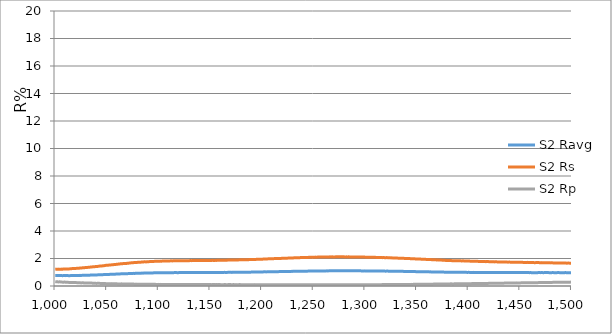
| Category | S2 Ravg | S2 Rs | S2 Rp |
|---|---|---|---|
| 1000.0 | 0.767 | 1.215 | 0.318 |
| 1000.49 | 0.764 | 1.228 | 0.3 |
| 1000.98 | 0.766 | 1.225 | 0.307 |
| 1001.47 | 0.764 | 1.221 | 0.306 |
| 1001.96 | 0.766 | 1.226 | 0.305 |
| 1002.45 | 0.763 | 1.222 | 0.305 |
| 1002.94 | 0.761 | 1.227 | 0.295 |
| 1003.43 | 0.763 | 1.224 | 0.303 |
| 1003.92 | 0.761 | 1.22 | 0.302 |
| 1004.4 | 0.759 | 1.225 | 0.293 |
| 1004.89 | 0.76 | 1.221 | 0.3 |
| 1005.61 | 0.765 | 1.232 | 0.298 |
| 1006.09 | 0.759 | 1.228 | 0.289 |
| 1006.58 | 0.761 | 1.233 | 0.288 |
| 1007.06 | 0.751 | 1.222 | 0.279 |
| 1007.54 | 0.757 | 1.227 | 0.287 |
| 1008.02 | 0.759 | 1.24 | 0.278 |
| 1008.5 | 0.764 | 1.244 | 0.285 |
| 1008.97 | 0.762 | 1.233 | 0.292 |
| 1009.45 | 0.76 | 1.245 | 0.275 |
| 1009.92 | 0.754 | 1.242 | 0.266 |
| 1010.4 | 0.756 | 1.247 | 0.266 |
| 1011.11 | 0.761 | 1.242 | 0.28 |
| 1011.58 | 0.763 | 1.254 | 0.272 |
| 1012.05 | 0.757 | 1.243 | 0.271 |
| 1012.52 | 0.759 | 1.248 | 0.27 |
| 1012.99 | 0.753 | 1.244 | 0.262 |
| 1013.46 | 0.759 | 1.25 | 0.268 |
| 1013.93 | 0.753 | 1.246 | 0.26 |
| 1014.4 | 0.759 | 1.258 | 0.259 |
| 1015.09 | 0.756 | 1.261 | 0.251 |
| 1015.56 | 0.758 | 1.258 | 0.257 |
| 1016.02 | 0.756 | 1.262 | 0.249 |
| 1016.48 | 0.762 | 1.267 | 0.256 |
| 1016.95 | 0.763 | 1.271 | 0.255 |
| 1017.41 | 0.765 | 1.275 | 0.254 |
| 1018.1 | 0.762 | 1.27 | 0.253 |
| 1018.55 | 0.764 | 1.275 | 0.253 |
| 1019.01 | 0.765 | 1.279 | 0.252 |
| 1019.47 | 0.756 | 1.268 | 0.244 |
| 1019.92 | 0.765 | 1.28 | 0.25 |
| 1020.6 | 0.77 | 1.29 | 0.249 |
| 1021.06 | 0.764 | 1.287 | 0.241 |
| 1021.51 | 0.77 | 1.291 | 0.248 |
| 1021.96 | 0.764 | 1.288 | 0.24 |
| 1022.41 | 0.766 | 1.293 | 0.239 |
| 1023.08 | 0.763 | 1.288 | 0.238 |
| 1023.53 | 0.768 | 1.299 | 0.238 |
| 1023.98 | 0.774 | 1.31 | 0.237 |
| 1024.42 | 0.768 | 1.307 | 0.229 |
| 1025.09 | 0.766 | 1.31 | 0.221 |
| 1025.53 | 0.771 | 1.315 | 0.228 |
| 1025.97 | 0.776 | 1.318 | 0.234 |
| 1026.42 | 0.774 | 1.322 | 0.226 |
| 1027.08 | 0.778 | 1.324 | 0.233 |
| 1027.52 | 0.776 | 1.328 | 0.225 |
| 1027.95 | 0.775 | 1.332 | 0.217 |
| 1028.61 | 0.782 | 1.341 | 0.223 |
| 1029.04 | 0.78 | 1.338 | 0.223 |
| 1029.48 | 0.778 | 1.334 | 0.222 |
| 1029.91 | 0.78 | 1.346 | 0.215 |
| 1030.56 | 0.777 | 1.348 | 0.207 |
| 1031.0 | 0.786 | 1.351 | 0.22 |
| 1031.43 | 0.781 | 1.355 | 0.206 |
| 1032.07 | 0.788 | 1.358 | 0.219 |
| 1032.5 | 0.783 | 1.355 | 0.211 |
| 1032.93 | 0.784 | 1.358 | 0.211 |
| 1033.57 | 0.792 | 1.374 | 0.21 |
| 1033.99 | 0.793 | 1.378 | 0.209 |
| 1034.42 | 0.788 | 1.375 | 0.202 |
| 1035.06 | 0.799 | 1.383 | 0.214 |
| 1035.48 | 0.797 | 1.387 | 0.207 |
| 1035.9 | 0.799 | 1.391 | 0.207 |
| 1036.53 | 0.792 | 1.386 | 0.199 |
| 1036.95 | 0.801 | 1.403 | 0.199 |
| 1037.58 | 0.805 | 1.405 | 0.204 |
| 1038.0 | 0.799 | 1.401 | 0.197 |
| 1038.42 | 0.801 | 1.405 | 0.197 |
| 1039.04 | 0.805 | 1.413 | 0.196 |
| 1039.46 | 0.803 | 1.41 | 0.196 |
| 1040.08 | 0.807 | 1.425 | 0.188 |
| 1040.49 | 0.805 | 1.421 | 0.188 |
| 1040.91 | 0.809 | 1.425 | 0.194 |
| 1041.53 | 0.81 | 1.433 | 0.187 |
| 1041.94 | 0.814 | 1.437 | 0.192 |
| 1042.55 | 0.815 | 1.438 | 0.192 |
| 1042.96 | 0.82 | 1.448 | 0.191 |
| 1043.58 | 0.817 | 1.443 | 0.19 |
| 1043.99 | 0.815 | 1.446 | 0.184 |
| 1044.6 | 0.812 | 1.448 | 0.177 |
| 1045.01 | 0.82 | 1.458 | 0.183 |
| 1045.41 | 0.821 | 1.467 | 0.176 |
| 1046.02 | 0.825 | 1.468 | 0.181 |
| 1046.43 | 0.829 | 1.472 | 0.187 |
| 1047.03 | 0.83 | 1.473 | 0.186 |
| 1047.44 | 0.825 | 1.477 | 0.173 |
| 1048.04 | 0.835 | 1.49 | 0.179 |
| 1048.44 | 0.836 | 1.493 | 0.179 |
| 1049.05 | 0.836 | 1.501 | 0.172 |
| 1049.45 | 0.831 | 1.491 | 0.171 |
| 1050.05 | 0.838 | 1.505 | 0.17 |
| 1050.45 | 0.842 | 1.509 | 0.176 |
| 1051.05 | 0.84 | 1.51 | 0.169 |
| 1051.45 | 0.841 | 1.513 | 0.169 |
| 1052.05 | 0.845 | 1.521 | 0.168 |
| 1052.45 | 0.842 | 1.517 | 0.168 |
| 1053.04 | 0.846 | 1.524 | 0.167 |
| 1053.44 | 0.844 | 1.521 | 0.167 |
| 1054.04 | 0.854 | 1.535 | 0.172 |
| 1054.44 | 0.852 | 1.538 | 0.166 |
| 1055.03 | 0.849 | 1.54 | 0.159 |
| 1055.43 | 0.857 | 1.549 | 0.165 |
| 1056.02 | 0.854 | 1.549 | 0.158 |
| 1056.42 | 0.861 | 1.558 | 0.164 |
| 1057.01 | 0.861 | 1.559 | 0.163 |
| 1057.41 | 0.86 | 1.563 | 0.157 |
| 1058.0 | 0.86 | 1.564 | 0.156 |
| 1058.6 | 0.866 | 1.57 | 0.162 |
| 1058.99 | 0.867 | 1.574 | 0.161 |
| 1059.58 | 0.867 | 1.586 | 0.149 |
| 1059.98 | 0.868 | 1.582 | 0.154 |
| 1060.57 | 0.871 | 1.588 | 0.154 |
| 1060.97 | 0.872 | 1.592 | 0.153 |
| 1061.56 | 0.876 | 1.599 | 0.153 |
| 1061.95 | 0.877 | 1.601 | 0.153 |
| 1062.55 | 0.88 | 1.609 | 0.152 |
| 1062.94 | 0.881 | 1.61 | 0.152 |
| 1063.54 | 0.881 | 1.611 | 0.151 |
| 1063.93 | 0.885 | 1.614 | 0.156 |
| 1064.52 | 0.883 | 1.621 | 0.145 |
| 1064.92 | 0.887 | 1.623 | 0.15 |
| 1065.51 | 0.884 | 1.624 | 0.144 |
| 1065.91 | 0.891 | 1.633 | 0.149 |
| 1066.5 | 0.889 | 1.634 | 0.143 |
| 1067.1 | 0.889 | 1.635 | 0.143 |
| 1067.5 | 0.893 | 1.643 | 0.143 |
| 1068.09 | 0.894 | 1.645 | 0.142 |
| 1068.49 | 0.895 | 1.647 | 0.142 |
| 1069.09 | 0.889 | 1.642 | 0.136 |
| 1069.49 | 0.899 | 1.656 | 0.141 |
| 1070.08 | 0.899 | 1.658 | 0.141 |
| 1070.48 | 0.901 | 1.661 | 0.141 |
| 1071.08 | 0.901 | 1.661 | 0.14 |
| 1071.48 | 0.902 | 1.665 | 0.14 |
| 1072.08 | 0.906 | 1.672 | 0.14 |
| 1072.49 | 0.91 | 1.68 | 0.139 |
| 1073.09 | 0.91 | 1.681 | 0.139 |
| 1073.49 | 0.912 | 1.684 | 0.139 |
| 1074.09 | 0.912 | 1.685 | 0.138 |
| 1074.5 | 0.914 | 1.689 | 0.138 |
| 1075.1 | 0.914 | 1.689 | 0.138 |
| 1075.51 | 0.915 | 1.698 | 0.132 |
| 1075.91 | 0.919 | 1.701 | 0.137 |
| 1076.52 | 0.92 | 1.702 | 0.137 |
| 1076.93 | 0.916 | 1.705 | 0.126 |
| 1077.54 | 0.921 | 1.706 | 0.137 |
| 1077.95 | 0.923 | 1.709 | 0.136 |
| 1078.56 | 0.923 | 1.716 | 0.131 |
| 1078.97 | 0.924 | 1.713 | 0.136 |
| 1079.59 | 0.93 | 1.725 | 0.136 |
| 1080.0 | 0.927 | 1.723 | 0.13 |
| 1080.41 | 0.925 | 1.721 | 0.13 |
| 1081.03 | 0.924 | 1.723 | 0.124 |
| 1081.44 | 0.925 | 1.721 | 0.129 |
| 1082.06 | 0.931 | 1.734 | 0.129 |
| 1082.48 | 0.93 | 1.737 | 0.124 |
| 1083.1 | 0.931 | 1.734 | 0.129 |
| 1083.52 | 0.933 | 1.742 | 0.123 |
| 1083.94 | 0.939 | 1.75 | 0.128 |
| 1084.56 | 0.938 | 1.747 | 0.128 |
| 1084.98 | 0.934 | 1.745 | 0.123 |
| 1085.4 | 0.94 | 1.753 | 0.128 |
| 1086.03 | 0.942 | 1.756 | 0.128 |
| 1086.46 | 0.938 | 1.754 | 0.122 |
| 1087.09 | 0.942 | 1.756 | 0.127 |
| 1087.52 | 0.943 | 1.76 | 0.127 |
| 1087.94 | 0.937 | 1.753 | 0.122 |
| 1088.58 | 0.941 | 1.76 | 0.122 |
| 1089.01 | 0.943 | 1.764 | 0.121 |
| 1089.44 | 0.942 | 1.762 | 0.121 |
| 1090.08 | 0.943 | 1.765 | 0.121 |
| 1090.51 | 0.945 | 1.769 | 0.121 |
| 1090.94 | 0.947 | 1.773 | 0.121 |
| 1091.59 | 0.945 | 1.77 | 0.121 |
| 1092.02 | 0.949 | 1.778 | 0.12 |
| 1092.46 | 0.949 | 1.777 | 0.12 |
| 1093.11 | 0.953 | 1.785 | 0.12 |
| 1093.54 | 0.954 | 1.789 | 0.12 |
| 1093.98 | 0.953 | 1.787 | 0.12 |
| 1094.42 | 0.955 | 1.786 | 0.125 |
| 1095.08 | 0.954 | 1.789 | 0.12 |
| 1095.52 | 0.951 | 1.788 | 0.114 |
| 1095.96 | 0.955 | 1.791 | 0.119 |
| 1096.4 | 0.955 | 1.791 | 0.119 |
| 1097.07 | 0.957 | 1.794 | 0.119 |
| 1097.51 | 0.958 | 1.798 | 0.119 |
| 1097.96 | 0.958 | 1.802 | 0.114 |
| 1098.41 | 0.955 | 1.795 | 0.114 |
| 1099.08 | 0.957 | 1.8 | 0.114 |
| 1099.53 | 0.959 | 1.804 | 0.114 |
| 1099.98 | 0.96 | 1.802 | 0.118 |
| 1100.43 | 0.96 | 1.801 | 0.118 |
| 1101.1 | 0.959 | 1.805 | 0.113 |
| 1101.56 | 0.961 | 1.804 | 0.118 |
| 1102.01 | 0.964 | 1.809 | 0.118 |
| 1102.47 | 0.96 | 1.808 | 0.113 |
| 1102.92 | 0.96 | 1.807 | 0.113 |
| 1103.61 | 0.959 | 1.811 | 0.108 |
| 1104.07 | 0.967 | 1.82 | 0.113 |
| 1104.53 | 0.964 | 1.814 | 0.113 |
| 1104.99 | 0.966 | 1.819 | 0.113 |
| 1105.45 | 0.963 | 1.813 | 0.113 |
| 1105.91 | 0.965 | 1.817 | 0.113 |
| 1106.61 | 0.965 | 1.817 | 0.112 |
| 1107.07 | 0.969 | 1.827 | 0.112 |
| 1107.54 | 0.967 | 1.821 | 0.112 |
| 1108.0 | 0.966 | 1.82 | 0.112 |
| 1108.47 | 0.966 | 1.821 | 0.112 |
| 1108.94 | 0.969 | 1.826 | 0.112 |
| 1109.41 | 0.966 | 1.82 | 0.112 |
| 1110.11 | 0.969 | 1.825 | 0.112 |
| 1110.58 | 0.971 | 1.83 | 0.112 |
| 1111.06 | 0.968 | 1.825 | 0.112 |
| 1111.53 | 0.966 | 1.826 | 0.107 |
| 1112.0 | 0.971 | 1.831 | 0.112 |
| 1112.48 | 0.971 | 1.831 | 0.112 |
| 1112.96 | 0.972 | 1.826 | 0.117 |
| 1113.43 | 0.969 | 1.826 | 0.112 |
| 1113.91 | 0.97 | 1.828 | 0.112 |
| 1114.39 | 0.975 | 1.838 | 0.112 |
| 1115.11 | 0.973 | 1.834 | 0.112 |
| 1115.59 | 0.973 | 1.834 | 0.112 |
| 1116.07 | 0.973 | 1.834 | 0.112 |
| 1116.56 | 0.971 | 1.835 | 0.107 |
| 1117.04 | 0.974 | 1.84 | 0.107 |
| 1117.52 | 0.974 | 1.836 | 0.112 |
| 1118.01 | 0.972 | 1.832 | 0.112 |
| 1118.49 | 0.973 | 1.838 | 0.107 |
| 1118.98 | 0.971 | 1.835 | 0.107 |
| 1119.47 | 0.974 | 1.836 | 0.112 |
| 1119.96 | 0.975 | 1.837 | 0.112 |
| 1120.45 | 0.972 | 1.838 | 0.107 |
| 1120.94 | 0.975 | 1.838 | 0.112 |
| 1121.43 | 0.978 | 1.843 | 0.112 |
| 1121.92 | 0.973 | 1.839 | 0.107 |
| 1122.41 | 0.976 | 1.844 | 0.107 |
| 1122.91 | 0.973 | 1.839 | 0.107 |
| 1123.4 | 0.973 | 1.838 | 0.107 |
| 1123.89 | 0.973 | 1.839 | 0.107 |
| 1124.39 | 0.976 | 1.844 | 0.107 |
| 1124.89 | 0.973 | 1.839 | 0.107 |
| 1125.38 | 0.971 | 1.834 | 0.107 |
| 1125.88 | 0.974 | 1.84 | 0.107 |
| 1126.38 | 0.974 | 1.845 | 0.102 |
| 1126.88 | 0.974 | 1.845 | 0.102 |
| 1127.38 | 0.976 | 1.845 | 0.107 |
| 1127.88 | 0.974 | 1.845 | 0.102 |
| 1128.38 | 0.976 | 1.845 | 0.107 |
| 1128.88 | 0.976 | 1.845 | 0.107 |
| 1129.38 | 0.976 | 1.845 | 0.107 |
| 1129.88 | 0.979 | 1.845 | 0.112 |
| 1130.39 | 0.977 | 1.846 | 0.107 |
| 1130.89 | 0.978 | 1.849 | 0.107 |
| 1131.4 | 0.977 | 1.847 | 0.107 |
| 1131.9 | 0.976 | 1.845 | 0.108 |
| 1132.41 | 0.976 | 1.849 | 0.103 |
| 1132.91 | 0.977 | 1.846 | 0.108 |
| 1133.42 | 0.983 | 1.853 | 0.113 |
| 1133.93 | 0.978 | 1.852 | 0.103 |
| 1134.43 | 0.974 | 1.846 | 0.103 |
| 1134.94 | 0.976 | 1.849 | 0.103 |
| 1135.45 | 0.978 | 1.848 | 0.108 |
| 1135.96 | 0.977 | 1.852 | 0.103 |
| 1136.47 | 0.974 | 1.846 | 0.103 |
| 1136.98 | 0.98 | 1.852 | 0.108 |
| 1137.49 | 0.975 | 1.847 | 0.103 |
| 1138.0 | 0.978 | 1.848 | 0.108 |
| 1138.51 | 0.978 | 1.849 | 0.108 |
| 1139.02 | 0.976 | 1.85 | 0.103 |
| 1139.53 | 0.974 | 1.851 | 0.098 |
| 1140.05 | 0.977 | 1.852 | 0.103 |
| 1140.56 | 0.983 | 1.859 | 0.108 |
| 1141.07 | 0.976 | 1.85 | 0.103 |
| 1141.58 | 0.982 | 1.857 | 0.108 |
| 1142.1 | 0.978 | 1.853 | 0.103 |
| 1142.61 | 0.976 | 1.849 | 0.103 |
| 1143.13 | 0.98 | 1.856 | 0.103 |
| 1143.38 | 0.978 | 1.853 | 0.103 |
| 1143.9 | 0.982 | 1.86 | 0.103 |
| 1144.41 | 0.977 | 1.855 | 0.098 |
| 1144.93 | 0.98 | 1.851 | 0.108 |
| 1145.44 | 0.978 | 1.852 | 0.103 |
| 1145.96 | 0.983 | 1.857 | 0.108 |
| 1146.47 | 0.98 | 1.857 | 0.103 |
| 1146.99 | 0.986 | 1.863 | 0.108 |
| 1147.5 | 0.984 | 1.859 | 0.108 |
| 1148.02 | 0.981 | 1.859 | 0.103 |
| 1148.54 | 0.982 | 1.86 | 0.103 |
| 1149.05 | 0.985 | 1.861 | 0.108 |
| 1149.57 | 0.98 | 1.857 | 0.104 |
| 1150.08 | 0.978 | 1.853 | 0.104 |
| 1150.6 | 0.982 | 1.864 | 0.099 |
| 1151.12 | 0.979 | 1.86 | 0.099 |
| 1151.63 | 0.984 | 1.865 | 0.104 |
| 1151.89 | 0.985 | 1.865 | 0.104 |
| 1152.41 | 0.983 | 1.862 | 0.104 |
| 1152.92 | 0.983 | 1.862 | 0.104 |
| 1153.44 | 0.98 | 1.857 | 0.104 |
| 1153.96 | 0.981 | 1.858 | 0.104 |
| 1154.47 | 0.981 | 1.858 | 0.104 |
| 1154.99 | 0.982 | 1.864 | 0.099 |
| 1155.5 | 0.984 | 1.865 | 0.104 |
| 1156.02 | 0.983 | 1.862 | 0.104 |
| 1156.54 | 0.984 | 1.863 | 0.104 |
| 1157.05 | 0.984 | 1.869 | 0.099 |
| 1157.57 | 0.982 | 1.87 | 0.094 |
| 1158.08 | 0.987 | 1.87 | 0.104 |
| 1158.6 | 0.985 | 1.866 | 0.104 |
| 1159.11 | 0.988 | 1.873 | 0.104 |
| 1159.63 | 0.986 | 1.874 | 0.099 |
| 1159.88 | 0.984 | 1.869 | 0.099 |
| 1160.4 | 0.979 | 1.869 | 0.089 |
| 1160.91 | 0.985 | 1.871 | 0.099 |
| 1161.43 | 0.988 | 1.872 | 0.104 |
| 1161.94 | 0.986 | 1.872 | 0.099 |
| 1162.45 | 0.987 | 1.874 | 0.099 |
| 1162.97 | 0.987 | 1.874 | 0.1 |
| 1163.48 | 0.985 | 1.87 | 0.1 |
| 1163.99 | 0.993 | 1.881 | 0.105 |
| 1164.5 | 0.986 | 1.872 | 0.1 |
| 1165.01 | 0.986 | 1.873 | 0.1 |
| 1165.53 | 0.984 | 1.874 | 0.095 |
| 1166.04 | 0.99 | 1.88 | 0.1 |
| 1166.55 | 0.988 | 1.876 | 0.1 |
| 1167.06 | 0.991 | 1.882 | 0.1 |
| 1167.57 | 0.989 | 1.877 | 0.1 |
| 1168.08 | 0.995 | 1.884 | 0.105 |
| 1168.58 | 0.99 | 1.88 | 0.1 |
| 1169.09 | 0.993 | 1.885 | 0.1 |
| 1169.6 | 0.991 | 1.881 | 0.1 |
| 1170.11 | 0.994 | 1.888 | 0.1 |
| 1170.61 | 0.994 | 1.883 | 0.105 |
| 1171.12 | 0.99 | 1.884 | 0.095 |
| 1171.63 | 0.993 | 1.885 | 0.1 |
| 1171.88 | 0.996 | 1.892 | 0.1 |
| 1172.38 | 0.994 | 1.893 | 0.095 |
| 1172.89 | 0.997 | 1.894 | 0.1 |
| 1173.39 | 0.995 | 1.895 | 0.095 |
| 1173.89 | 0.995 | 1.895 | 0.095 |
| 1174.4 | 0.993 | 1.891 | 0.095 |
| 1174.9 | 0.996 | 1.891 | 0.101 |
| 1175.4 | 0.996 | 1.892 | 0.101 |
| 1175.9 | 0.997 | 1.899 | 0.096 |
| 1176.4 | 0.998 | 1.9 | 0.096 |
| 1176.9 | 0.996 | 1.896 | 0.096 |
| 1177.4 | 0.999 | 1.902 | 0.096 |
| 1177.9 | 1.002 | 1.903 | 0.101 |
| 1178.39 | 1 | 1.904 | 0.096 |
| 1178.89 | 1.001 | 1.9 | 0.101 |
| 1179.39 | 1.001 | 1.902 | 0.101 |
| 1179.88 | 1.002 | 1.907 | 0.096 |
| 1180.62 | 1.001 | 1.904 | 0.098 |
| 1181.12 | 0.999 | 1.901 | 0.098 |
| 1181.61 | 1.001 | 1.905 | 0.098 |
| 1182.1 | 1 | 1.907 | 0.093 |
| 1182.59 | 1.002 | 1.907 | 0.097 |
| 1183.08 | 1.003 | 1.909 | 0.097 |
| 1183.57 | 1 | 1.907 | 0.093 |
| 1184.06 | 1.004 | 1.915 | 0.093 |
| 1184.55 | 1.004 | 1.911 | 0.097 |
| 1185.03 | 1.005 | 1.913 | 0.097 |
| 1185.52 | 1.005 | 1.913 | 0.097 |
| 1186.01 | 1.004 | 1.911 | 0.097 |
| 1186.49 | 1.005 | 1.916 | 0.093 |
| 1186.97 | 1.006 | 1.915 | 0.097 |
| 1187.46 | 1.006 | 1.919 | 0.093 |
| 1187.94 | 1.007 | 1.922 | 0.093 |
| 1188.42 | 1.006 | 1.916 | 0.097 |
| 1188.9 | 1.006 | 1.919 | 0.092 |
| 1189.62 | 1.009 | 1.923 | 0.096 |
| 1190.1 | 1.013 | 1.933 | 0.092 |
| 1190.57 | 1.01 | 1.927 | 0.092 |
| 1191.05 | 1.014 | 1.932 | 0.096 |
| 1191.53 | 1.013 | 1.93 | 0.096 |
| 1192.0 | 1.015 | 1.934 | 0.096 |
| 1192.47 | 1.012 | 1.928 | 0.096 |
| 1192.95 | 1.016 | 1.932 | 0.1 |
| 1193.42 | 1.013 | 1.931 | 0.095 |
| 1193.89 | 1.011 | 1.931 | 0.091 |
| 1194.59 | 1.02 | 1.944 | 0.095 |
| 1195.06 | 1.017 | 1.944 | 0.091 |
| 1195.53 | 1.016 | 1.938 | 0.095 |
| 1195.99 | 1.016 | 1.938 | 0.095 |
| 1196.46 | 1.016 | 1.942 | 0.09 |
| 1196.92 | 1.022 | 1.95 | 0.094 |
| 1197.39 | 1.022 | 1.949 | 0.094 |
| 1198.08 | 1.021 | 1.948 | 0.094 |
| 1198.54 | 1.025 | 1.952 | 0.098 |
| 1199.0 | 1.019 | 1.948 | 0.09 |
| 1199.46 | 1.023 | 1.955 | 0.09 |
| 1199.92 | 1.024 | 1.955 | 0.094 |
| 1200.61 | 1.026 | 1.959 | 0.093 |
| 1201.06 | 1.024 | 1.954 | 0.093 |
| 1201.52 | 1.026 | 1.958 | 0.093 |
| 1201.97 | 1.03 | 1.967 | 0.093 |
| 1202.42 | 1.025 | 1.957 | 0.093 |
| 1203.1 | 1.031 | 1.964 | 0.097 |
| 1203.55 | 1.027 | 1.965 | 0.089 |
| 1204.0 | 1.027 | 1.965 | 0.089 |
| 1204.45 | 1.03 | 1.968 | 0.092 |
| 1204.9 | 1.028 | 1.967 | 0.088 |
| 1205.57 | 1.029 | 1.966 | 0.092 |
| 1206.01 | 1.031 | 1.975 | 0.088 |
| 1206.46 | 1.03 | 1.969 | 0.092 |
| 1206.9 | 1.032 | 1.973 | 0.092 |
| 1207.57 | 1.034 | 1.977 | 0.092 |
| 1208.01 | 1.036 | 1.98 | 0.091 |
| 1208.45 | 1.038 | 1.98 | 0.095 |
| 1209.11 | 1.035 | 1.98 | 0.091 |
| 1209.54 | 1.034 | 1.977 | 0.091 |
| 1209.98 | 1.038 | 1.986 | 0.091 |
| 1210.42 | 1.039 | 1.986 | 0.091 |
| 1211.07 | 1.038 | 1.985 | 0.091 |
| 1211.5 | 1.044 | 1.993 | 0.095 |
| 1211.94 | 1.041 | 1.992 | 0.091 |
| 1212.58 | 1.039 | 1.988 | 0.091 |
| 1213.01 | 1.043 | 1.996 | 0.09 |
| 1213.44 | 1.043 | 1.995 | 0.09 |
| 1214.09 | 1.043 | 1.991 | 0.094 |
| 1214.51 | 1.046 | 1.998 | 0.094 |
| 1214.94 | 1.045 | 1.999 | 0.09 |
| 1215.58 | 1.046 | 1.998 | 0.094 |
| 1216.0 | 1.044 | 1.997 | 0.09 |
| 1216.43 | 1.042 | 1.998 | 0.086 |
| 1217.06 | 1.049 | 2.005 | 0.094 |
| 1217.48 | 1.047 | 2.005 | 0.09 |
| 1217.9 | 1.048 | 2.003 | 0.093 |
| 1218.53 | 1.05 | 2.011 | 0.089 |
| 1218.95 | 1.052 | 2.01 | 0.093 |
| 1219.58 | 1.052 | 2.014 | 0.089 |
| 1220.0 | 1.052 | 2.019 | 0.085 |
| 1220.41 | 1.052 | 2.014 | 0.089 |
| 1221.04 | 1.053 | 2.013 | 0.093 |
| 1221.45 | 1.051 | 2.017 | 0.085 |
| 1222.07 | 1.052 | 2.016 | 0.089 |
| 1222.48 | 1.053 | 2.021 | 0.085 |
| 1223.1 | 1.054 | 2.019 | 0.089 |
| 1223.51 | 1.054 | 2.019 | 0.089 |
| 1223.92 | 1.056 | 2.023 | 0.089 |
| 1224.53 | 1.056 | 2.027 | 0.085 |
| 1224.94 | 1.058 | 2.027 | 0.088 |
| 1225.55 | 1.057 | 2.026 | 0.088 |
| 1225.96 | 1.059 | 2.03 | 0.088 |
| 1226.57 | 1.059 | 2.033 | 0.084 |
| 1226.98 | 1.06 | 2.032 | 0.088 |
| 1227.58 | 1.062 | 2.036 | 0.088 |
| 1227.99 | 1.062 | 2.037 | 0.088 |
| 1228.59 | 1.064 | 2.04 | 0.088 |
| 1229.0 | 1.064 | 2.044 | 0.084 |
| 1229.6 | 1.065 | 2.043 | 0.088 |
| 1230.0 | 1.063 | 2.039 | 0.088 |
| 1230.6 | 1.068 | 2.047 | 0.088 |
| 1231.0 | 1.067 | 2.047 | 0.088 |
| 1231.6 | 1.067 | 2.046 | 0.088 |
| 1232.0 | 1.069 | 2.05 | 0.088 |
| 1232.6 | 1.07 | 2.053 | 0.088 |
| 1233.0 | 1.068 | 2.053 | 0.084 |
| 1233.6 | 1.067 | 2.051 | 0.084 |
| 1233.99 | 1.068 | 2.052 | 0.084 |
| 1234.59 | 1.071 | 2.056 | 0.087 |
| 1234.98 | 1.071 | 2.054 | 0.087 |
| 1235.58 | 1.073 | 2.059 | 0.087 |
| 1235.97 | 1.074 | 2.061 | 0.087 |
| 1236.57 | 1.073 | 2.063 | 0.083 |
| 1236.96 | 1.077 | 2.063 | 0.091 |
| 1237.56 | 1.075 | 2.064 | 0.087 |
| 1237.95 | 1.075 | 2.067 | 0.083 |
| 1238.54 | 1.078 | 2.065 | 0.091 |
| 1238.94 | 1.076 | 2.065 | 0.087 |
| 1239.53 | 1.078 | 2.068 | 0.087 |
| 1239.92 | 1.077 | 2.067 | 0.087 |
| 1240.51 | 1.079 | 2.072 | 0.087 |
| 1241.1 | 1.08 | 2.073 | 0.087 |
| 1241.5 | 1.081 | 2.076 | 0.087 |
| 1242.09 | 1.079 | 2.075 | 0.083 |
| 1242.48 | 1.081 | 2.075 | 0.087 |
| 1243.07 | 1.08 | 2.074 | 0.087 |
| 1243.46 | 1.079 | 2.072 | 0.087 |
| 1244.05 | 1.08 | 2.074 | 0.087 |
| 1244.44 | 1.083 | 2.079 | 0.086 |
| 1245.04 | 1.084 | 2.082 | 0.086 |
| 1245.43 | 1.084 | 2.082 | 0.086 |
| 1246.02 | 1.082 | 2.082 | 0.083 |
| 1246.41 | 1.084 | 2.081 | 0.086 |
| 1247.0 | 1.089 | 2.091 | 0.086 |
| 1247.59 | 1.084 | 2.086 | 0.083 |
| 1247.99 | 1.088 | 2.089 | 0.086 |
| 1248.58 | 1.087 | 2.088 | 0.086 |
| 1248.98 | 1.088 | 2.093 | 0.082 |
| 1249.57 | 1.091 | 2.093 | 0.09 |
| 1249.96 | 1.089 | 2.092 | 0.086 |
| 1250.56 | 1.092 | 2.094 | 0.09 |
| 1250.95 | 1.09 | 2.093 | 0.086 |
| 1251.55 | 1.094 | 2.098 | 0.09 |
| 1251.95 | 1.093 | 2.101 | 0.086 |
| 1252.54 | 1.087 | 2.092 | 0.082 |
| 1252.94 | 1.092 | 2.097 | 0.086 |
| 1253.54 | 1.091 | 2.097 | 0.086 |
| 1253.94 | 1.093 | 2.101 | 0.086 |
| 1254.53 | 1.093 | 2.101 | 0.086 |
| 1254.93 | 1.093 | 2.101 | 0.086 |
| 1255.53 | 1.095 | 2.105 | 0.086 |
| 1255.93 | 1.095 | 2.105 | 0.086 |
| 1256.54 | 1.095 | 2.104 | 0.086 |
| 1256.94 | 1.093 | 2.101 | 0.086 |
| 1257.54 | 1.097 | 2.105 | 0.09 |
| 1257.95 | 1.097 | 2.108 | 0.086 |
| 1258.55 | 1.097 | 2.108 | 0.086 |
| 1258.96 | 1.097 | 2.109 | 0.086 |
| 1259.56 | 1.095 | 2.105 | 0.086 |
| 1259.97 | 1.096 | 2.109 | 0.082 |
| 1260.58 | 1.097 | 2.109 | 0.086 |
| 1260.99 | 1.097 | 2.108 | 0.086 |
| 1261.6 | 1.101 | 2.117 | 0.086 |
| 1262.01 | 1.097 | 2.112 | 0.082 |
| 1262.42 | 1.101 | 2.116 | 0.086 |
| 1263.04 | 1.101 | 2.117 | 0.086 |
| 1263.45 | 1.1 | 2.113 | 0.086 |
| 1264.07 | 1.098 | 2.11 | 0.086 |
| 1264.48 | 1.1 | 2.114 | 0.086 |
| 1265.1 | 1.102 | 2.114 | 0.089 |
| 1265.51 | 1.101 | 2.116 | 0.086 |
| 1265.93 | 1.101 | 2.12 | 0.082 |
| 1266.56 | 1.101 | 2.116 | 0.086 |
| 1266.97 | 1.103 | 2.116 | 0.089 |
| 1267.6 | 1.103 | 2.121 | 0.086 |
| 1268.02 | 1.103 | 2.12 | 0.086 |
| 1268.44 | 1.1 | 2.114 | 0.086 |
| 1269.07 | 1.103 | 2.116 | 0.089 |
| 1269.49 | 1.105 | 2.121 | 0.089 |
| 1269.92 | 1.103 | 2.117 | 0.089 |
| 1270.55 | 1.103 | 2.121 | 0.086 |
| 1270.98 | 1.102 | 2.118 | 0.086 |
| 1271.41 | 1.1 | 2.117 | 0.082 |
| 1272.05 | 1.104 | 2.122 | 0.086 |
| 1272.47 | 1.098 | 2.114 | 0.082 |
| 1272.9 | 1.104 | 2.123 | 0.086 |
| 1273.55 | 1.105 | 2.121 | 0.089 |
| 1273.98 | 1.102 | 2.119 | 0.086 |
| 1274.41 | 1.102 | 2.119 | 0.086 |
| 1275.06 | 1.105 | 2.12 | 0.089 |
| 1275.5 | 1.103 | 2.12 | 0.086 |
| 1275.93 | 1.106 | 2.122 | 0.089 |
| 1276.59 | 1.103 | 2.121 | 0.086 |
| 1277.02 | 1.106 | 2.123 | 0.089 |
| 1277.46 | 1.107 | 2.124 | 0.089 |
| 1277.9 | 1.105 | 2.124 | 0.086 |
| 1278.56 | 1.102 | 2.118 | 0.086 |
| 1279.0 | 1.107 | 2.125 | 0.09 |
| 1279.45 | 1.103 | 2.12 | 0.086 |
| 1280.11 | 1.102 | 2.117 | 0.086 |
| 1280.56 | 1.104 | 2.118 | 0.09 |
| 1281.0 | 1.102 | 2.117 | 0.086 |
| 1281.45 | 1.102 | 2.118 | 0.086 |
| 1281.9 | 1.104 | 2.119 | 0.09 |
| 1282.57 | 1.104 | 2.121 | 0.086 |
| 1283.02 | 1.101 | 2.116 | 0.086 |
| 1283.47 | 1.103 | 2.116 | 0.09 |
| 1283.93 | 1.107 | 2.12 | 0.093 |
| 1284.61 | 1.104 | 2.118 | 0.09 |
| 1285.06 | 1.103 | 2.116 | 0.09 |
| 1285.52 | 1.105 | 2.12 | 0.09 |
| 1285.97 | 1.103 | 2.116 | 0.09 |
| 1286.43 | 1.103 | 2.116 | 0.09 |
| 1286.89 | 1.102 | 2.118 | 0.086 |
| 1287.58 | 1.106 | 2.118 | 0.094 |
| 1288.04 | 1.102 | 2.118 | 0.086 |
| 1288.5 | 1.103 | 2.12 | 0.086 |
| 1288.96 | 1.105 | 2.117 | 0.094 |
| 1289.43 | 1.101 | 2.113 | 0.09 |
| 1289.89 | 1.102 | 2.114 | 0.09 |
| 1290.59 | 1.103 | 2.12 | 0.086 |
| 1291.06 | 1.1 | 2.11 | 0.09 |
| 1291.52 | 1.101 | 2.113 | 0.09 |
| 1291.99 | 1.104 | 2.117 | 0.09 |
| 1292.46 | 1.102 | 2.114 | 0.09 |
| 1292.93 | 1.104 | 2.114 | 0.094 |
| 1293.4 | 1.102 | 2.114 | 0.09 |
| 1294.11 | 1.1 | 2.111 | 0.09 |
| 1294.59 | 1.099 | 2.107 | 0.09 |
| 1295.06 | 1.103 | 2.112 | 0.094 |
| 1295.54 | 1.104 | 2.113 | 0.094 |
| 1296.01 | 1.1 | 2.106 | 0.094 |
| 1296.49 | 1.101 | 2.111 | 0.09 |
| 1296.97 | 1.097 | 2.103 | 0.09 |
| 1297.45 | 1.099 | 2.108 | 0.09 |
| 1297.93 | 1.096 | 2.101 | 0.09 |
| 1298.41 | 1.098 | 2.101 | 0.094 |
| 1298.89 | 1.101 | 2.107 | 0.094 |
| 1299.61 | 1.1 | 2.105 | 0.094 |
| 1300.1 | 1.096 | 2.099 | 0.094 |
| 1300.58 | 1.098 | 2.101 | 0.094 |
| 1301.07 | 1.096 | 2.097 | 0.095 |
| 1301.55 | 1.098 | 2.102 | 0.095 |
| 1302.04 | 1.093 | 2.095 | 0.091 |
| 1302.53 | 1.095 | 2.1 | 0.091 |
| 1303.02 | 1.096 | 2.094 | 0.098 |
| 1303.51 | 1.096 | 2.097 | 0.095 |
| 1304.0 | 1.097 | 2.1 | 0.095 |
| 1304.49 | 1.095 | 2.095 | 0.095 |
| 1304.98 | 1.096 | 2.098 | 0.095 |
| 1305.47 | 1.096 | 2.098 | 0.095 |
| 1305.96 | 1.095 | 2.094 | 0.095 |
| 1306.46 | 1.095 | 2.092 | 0.099 |
| 1306.95 | 1.093 | 2.086 | 0.099 |
| 1307.45 | 1.094 | 2.093 | 0.095 |
| 1307.94 | 1.096 | 2.093 | 0.099 |
| 1308.44 | 1.091 | 2.086 | 0.095 |
| 1308.94 | 1.093 | 2.087 | 0.099 |
| 1309.43 | 1.095 | 2.092 | 0.099 |
| 1309.93 | 1.091 | 2.082 | 0.099 |
| 1310.43 | 1.091 | 2.084 | 0.099 |
| 1310.93 | 1.088 | 2.08 | 0.095 |
| 1311.43 | 1.089 | 2.083 | 0.095 |
| 1311.93 | 1.086 | 2.077 | 0.095 |
| 1312.43 | 1.087 | 2.079 | 0.095 |
| 1312.94 | 1.087 | 2.075 | 0.099 |
| 1313.44 | 1.086 | 2.076 | 0.095 |
| 1313.94 | 1.088 | 2.077 | 0.099 |
| 1314.44 | 1.087 | 2.075 | 0.099 |
| 1314.95 | 1.09 | 2.08 | 0.099 |
| 1315.45 | 1.088 | 2.076 | 0.099 |
| 1315.96 | 1.086 | 2.073 | 0.1 |
| 1316.47 | 1.087 | 2.074 | 0.1 |
| 1316.97 | 1.083 | 2.062 | 0.103 |
| 1317.48 | 1.084 | 2.067 | 0.1 |
| 1317.99 | 1.085 | 2.067 | 0.104 |
| 1318.49 | 1.083 | 2.065 | 0.1 |
| 1319.0 | 1.082 | 2.061 | 0.104 |
| 1319.51 | 1.081 | 2.063 | 0.1 |
| 1320.02 | 1.08 | 2.06 | 0.1 |
| 1320.53 | 1.08 | 2.056 | 0.104 |
| 1321.04 | 1.085 | 2.066 | 0.104 |
| 1321.55 | 1.079 | 2.054 | 0.104 |
| 1322.06 | 1.084 | 2.061 | 0.108 |
| 1322.57 | 1.079 | 2.054 | 0.104 |
| 1323.08 | 1.074 | 2.049 | 0.1 |
| 1323.59 | 1.079 | 2.054 | 0.104 |
| 1324.1 | 1.077 | 2.051 | 0.104 |
| 1324.61 | 1.076 | 2.048 | 0.104 |
| 1325.13 | 1.076 | 2.044 | 0.108 |
| 1325.38 | 1.075 | 2.045 | 0.104 |
| 1325.89 | 1.078 | 2.047 | 0.108 |
| 1326.41 | 1.074 | 2.044 | 0.104 |
| 1326.92 | 1.072 | 2.039 | 0.104 |
| 1327.43 | 1.073 | 2.041 | 0.104 |
| 1327.95 | 1.074 | 2.043 | 0.104 |
| 1328.46 | 1.073 | 2.038 | 0.108 |
| 1328.97 | 1.07 | 2.036 | 0.105 |
| 1329.49 | 1.071 | 2.037 | 0.105 |
| 1330.0 | 1.071 | 2.034 | 0.109 |
| 1330.51 | 1.072 | 2.034 | 0.109 |
| 1331.03 | 1.07 | 2.032 | 0.109 |
| 1331.54 | 1.071 | 2.033 | 0.109 |
| 1332.06 | 1.068 | 2.024 | 0.113 |
| 1332.57 | 1.068 | 2.026 | 0.109 |
| 1333.08 | 1.067 | 2.022 | 0.113 |
| 1333.6 | 1.068 | 2.028 | 0.109 |
| 1334.11 | 1.069 | 2.025 | 0.113 |
| 1334.63 | 1.063 | 2.016 | 0.109 |
| 1334.88 | 1.065 | 2.017 | 0.113 |
| 1335.4 | 1.066 | 2.018 | 0.113 |
| 1335.91 | 1.068 | 2.019 | 0.117 |
| 1336.43 | 1.061 | 2.013 | 0.109 |
| 1336.94 | 1.063 | 2.014 | 0.113 |
| 1337.45 | 1.062 | 2.011 | 0.113 |
| 1337.97 | 1.058 | 2.007 | 0.109 |
| 1338.48 | 1.061 | 2.008 | 0.113 |
| 1338.99 | 1.06 | 2.004 | 0.117 |
| 1339.51 | 1.06 | 2.007 | 0.113 |
| 1340.02 | 1.058 | 2.002 | 0.113 |
| 1340.53 | 1.057 | 2 | 0.113 |
| 1341.05 | 1.06 | 2.002 | 0.117 |
| 1341.56 | 1.06 | 2.003 | 0.118 |
| 1342.07 | 1.055 | 1.996 | 0.114 |
| 1342.58 | 1.058 | 1.993 | 0.122 |
| 1343.09 | 1.057 | 1.996 | 0.118 |
| 1343.61 | 1.051 | 1.988 | 0.114 |
| 1344.12 | 1.05 | 1.986 | 0.114 |
| 1344.63 | 1.055 | 1.991 | 0.118 |
| 1344.88 | 1.05 | 1.982 | 0.118 |
| 1345.39 | 1.053 | 1.983 | 0.123 |
| 1345.9 | 1.05 | 1.986 | 0.115 |
| 1346.41 | 1.053 | 1.982 | 0.123 |
| 1346.92 | 1.054 | 1.986 | 0.123 |
| 1347.43 | 1.053 | 1.982 | 0.123 |
| 1347.94 | 1.05 | 1.98 | 0.12 |
| 1348.45 | 1.047 | 1.973 | 0.12 |
| 1348.96 | 1.044 | 1.965 | 0.124 |
| 1349.46 | 1.047 | 1.969 | 0.124 |
| 1349.97 | 1.044 | 1.968 | 0.12 |
| 1350.48 | 1.045 | 1.965 | 0.125 |
| 1350.98 | 1.044 | 1.963 | 0.125 |
| 1351.49 | 1.044 | 1.966 | 0.122 |
| 1351.99 | 1.045 | 1.968 | 0.122 |
| 1352.5 | 1.039 | 1.954 | 0.123 |
| 1353.0 | 1.044 | 1.96 | 0.128 |
| 1353.5 | 1.039 | 1.954 | 0.124 |
| 1354.01 | 1.039 | 1.954 | 0.125 |
| 1354.51 | 1.04 | 1.955 | 0.125 |
| 1355.01 | 1.038 | 1.951 | 0.125 |
| 1355.51 | 1.036 | 1.947 | 0.125 |
| 1356.01 | 1.035 | 1.945 | 0.125 |
| 1356.51 | 1.036 | 1.947 | 0.125 |
| 1357.01 | 1.032 | 1.939 | 0.125 |
| 1357.51 | 1.036 | 1.942 | 0.13 |
| 1358.01 | 1.034 | 1.942 | 0.127 |
| 1358.5 | 1.032 | 1.937 | 0.128 |
| 1359.0 | 1.034 | 1.935 | 0.133 |
| 1359.5 | 1.034 | 1.938 | 0.13 |
| 1359.99 | 1.03 | 1.93 | 0.13 |
| 1360.48 | 1.033 | 1.932 | 0.135 |
| 1360.98 | 1.03 | 1.926 | 0.135 |
| 1361.47 | 1.031 | 1.928 | 0.134 |
| 1361.96 | 1.026 | 1.919 | 0.133 |
| 1362.45 | 1.031 | 1.925 | 0.137 |
| 1362.95 | 1.029 | 1.925 | 0.133 |
| 1363.44 | 1.027 | 1.922 | 0.132 |
| 1363.92 | 1.025 | 1.918 | 0.132 |
| 1364.41 | 1.024 | 1.916 | 0.132 |
| 1364.9 | 1.024 | 1.911 | 0.136 |
| 1365.39 | 1.024 | 1.913 | 0.136 |
| 1366.12 | 1.025 | 1.914 | 0.136 |
| 1366.6 | 1.027 | 1.913 | 0.141 |
| 1367.09 | 1.023 | 1.909 | 0.137 |
| 1367.57 | 1.024 | 1.907 | 0.141 |
| 1368.05 | 1.02 | 1.904 | 0.136 |
| 1368.53 | 1.021 | 1.902 | 0.14 |
| 1369.01 | 1.018 | 1.897 | 0.14 |
| 1369.49 | 1.022 | 1.905 | 0.14 |
| 1369.97 | 1.022 | 1.902 | 0.143 |
| 1370.45 | 1.02 | 1.896 | 0.143 |
| 1370.93 | 1.019 | 1.892 | 0.146 |
| 1371.4 | 1.019 | 1.898 | 0.141 |
| 1372.11 | 1.016 | 1.887 | 0.145 |
| 1372.59 | 1.014 | 1.888 | 0.14 |
| 1373.06 | 1.016 | 1.887 | 0.145 |
| 1373.53 | 1.015 | 1.885 | 0.145 |
| 1374.01 | 1.014 | 1.883 | 0.145 |
| 1374.48 | 1.014 | 1.882 | 0.145 |
| 1374.95 | 1.011 | 1.876 | 0.146 |
| 1375.41 | 1.01 | 1.874 | 0.146 |
| 1376.11 | 1.009 | 1.876 | 0.142 |
| 1376.58 | 1.009 | 1.874 | 0.143 |
| 1377.05 | 1.008 | 1.872 | 0.144 |
| 1377.51 | 1.009 | 1.869 | 0.149 |
| 1377.97 | 1.004 | 1.861 | 0.146 |
| 1378.44 | 1.007 | 1.862 | 0.152 |
| 1378.9 | 1.006 | 1.863 | 0.15 |
| 1379.59 | 1.004 | 1.856 | 0.151 |
| 1380.05 | 1.005 | 1.859 | 0.151 |
| 1380.5 | 1.005 | 1.859 | 0.152 |
| 1380.96 | 1.003 | 1.859 | 0.147 |
| 1381.42 | 1.003 | 1.856 | 0.151 |
| 1382.1 | 1.004 | 1.854 | 0.154 |
| 1382.55 | 1.006 | 1.858 | 0.153 |
| 1383.01 | 1.004 | 1.852 | 0.156 |
| 1383.46 | 1.002 | 1.854 | 0.151 |
| 1383.91 | 0.999 | 1.843 | 0.154 |
| 1384.58 | 0.997 | 1.841 | 0.154 |
| 1385.03 | 0.999 | 1.844 | 0.154 |
| 1385.48 | 0.999 | 1.844 | 0.154 |
| 1385.93 | 0.997 | 1.841 | 0.154 |
| 1386.59 | 0.998 | 1.842 | 0.154 |
| 1387.04 | 0.999 | 1.841 | 0.158 |
| 1387.48 | 1.001 | 1.841 | 0.161 |
| 1387.92 | 1 | 1.843 | 0.157 |
| 1388.58 | 0.997 | 1.837 | 0.157 |
| 1389.02 | 0.995 | 1.834 | 0.157 |
| 1389.46 | 0.995 | 1.833 | 0.157 |
| 1389.9 | 0.996 | 1.835 | 0.157 |
| 1390.56 | 0.994 | 1.826 | 0.163 |
| 1390.99 | 0.997 | 1.836 | 0.159 |
| 1391.43 | 0.999 | 1.829 | 0.168 |
| 1392.08 | 0.997 | 1.834 | 0.16 |
| 1392.51 | 0.992 | 1.824 | 0.16 |
| 1392.94 | 0.994 | 1.826 | 0.161 |
| 1393.59 | 0.993 | 1.824 | 0.162 |
| 1394.01 | 0.996 | 1.827 | 0.166 |
| 1394.44 | 0.992 | 1.821 | 0.162 |
| 1395.08 | 0.998 | 1.83 | 0.166 |
| 1395.51 | 0.99 | 1.819 | 0.161 |
| 1395.93 | 0.994 | 1.819 | 0.168 |
| 1396.57 | 0.991 | 1.815 | 0.167 |
| 1396.99 | 0.991 | 1.815 | 0.167 |
| 1397.42 | 0.993 | 1.818 | 0.168 |
| 1398.05 | 0.992 | 1.816 | 0.169 |
| 1398.47 | 0.99 | 1.809 | 0.17 |
| 1399.1 | 0.989 | 1.811 | 0.166 |
| 1399.52 | 0.991 | 1.816 | 0.166 |
| 1399.93 | 0.992 | 1.814 | 0.17 |
| 1400.56 | 0.99 | 1.811 | 0.169 |
| 1400.97 | 0.99 | 1.813 | 0.168 |
| 1401.59 | 0.988 | 1.808 | 0.167 |
| 1402.01 | 0.988 | 1.803 | 0.172 |
| 1402.42 | 0.989 | 1.801 | 0.176 |
| 1403.04 | 0.989 | 1.806 | 0.173 |
| 1403.45 | 0.991 | 1.803 | 0.178 |
| 1404.06 | 0.989 | 1.799 | 0.179 |
| 1404.47 | 0.988 | 1.797 | 0.179 |
| 1405.09 | 0.991 | 1.803 | 0.178 |
| 1405.49 | 0.986 | 1.798 | 0.174 |
| 1406.1 | 0.985 | 1.797 | 0.174 |
| 1406.51 | 0.986 | 1.795 | 0.178 |
| 1406.91 | 0.986 | 1.793 | 0.178 |
| 1407.52 | 0.987 | 1.797 | 0.178 |
| 1407.93 | 0.984 | 1.791 | 0.178 |
| 1408.53 | 0.991 | 1.8 | 0.182 |
| 1408.93 | 0.985 | 1.793 | 0.177 |
| 1409.53 | 0.983 | 1.786 | 0.181 |
| 1409.94 | 0.986 | 1.787 | 0.185 |
| 1410.54 | 0.984 | 1.788 | 0.18 |
| 1410.94 | 0.984 | 1.788 | 0.18 |
| 1411.53 | 0.981 | 1.781 | 0.18 |
| 1411.93 | 0.984 | 1.784 | 0.185 |
| 1412.53 | 0.985 | 1.785 | 0.185 |
| 1412.93 | 0.981 | 1.777 | 0.186 |
| 1413.52 | 0.984 | 1.783 | 0.186 |
| 1413.92 | 0.985 | 1.785 | 0.186 |
| 1414.51 | 0.983 | 1.781 | 0.185 |
| 1414.91 | 0.983 | 1.777 | 0.189 |
| 1415.5 | 0.984 | 1.78 | 0.189 |
| 1416.09 | 0.982 | 1.775 | 0.189 |
| 1416.49 | 0.983 | 1.777 | 0.189 |
| 1417.08 | 0.98 | 1.771 | 0.189 |
| 1417.47 | 0.984 | 1.773 | 0.194 |
| 1418.06 | 0.986 | 1.782 | 0.19 |
| 1418.45 | 0.98 | 1.771 | 0.19 |
| 1419.04 | 0.982 | 1.775 | 0.19 |
| 1419.43 | 0.978 | 1.767 | 0.19 |
| 1420.02 | 0.982 | 1.771 | 0.194 |
| 1420.41 | 0.982 | 1.77 | 0.193 |
| 1421.0 | 0.982 | 1.77 | 0.193 |
| 1421.59 | 0.977 | 1.761 | 0.193 |
| 1421.98 | 0.978 | 1.763 | 0.194 |
| 1422.56 | 0.976 | 1.759 | 0.194 |
| 1422.96 | 0.979 | 1.76 | 0.198 |
| 1423.54 | 0.977 | 1.76 | 0.194 |
| 1423.93 | 0.976 | 1.759 | 0.194 |
| 1424.52 | 0.981 | 1.764 | 0.198 |
| 1424.91 | 0.976 | 1.754 | 0.198 |
| 1425.5 | 0.976 | 1.754 | 0.198 |
| 1426.08 | 0.977 | 1.756 | 0.198 |
| 1426.47 | 0.98 | 1.761 | 0.198 |
| 1427.06 | 0.977 | 1.756 | 0.198 |
| 1427.45 | 0.978 | 1.757 | 0.198 |
| 1428.04 | 0.978 | 1.754 | 0.203 |
| 1428.43 | 0.981 | 1.754 | 0.207 |
| 1429.02 | 0.975 | 1.751 | 0.199 |
| 1429.41 | 0.978 | 1.753 | 0.203 |
| 1430.0 | 0.976 | 1.749 | 0.203 |
| 1430.59 | 0.98 | 1.752 | 0.208 |
| 1430.98 | 0.976 | 1.747 | 0.204 |
| 1431.57 | 0.978 | 1.752 | 0.204 |
| 1431.96 | 0.981 | 1.754 | 0.208 |
| 1432.56 | 0.978 | 1.749 | 0.208 |
| 1432.95 | 0.974 | 1.743 | 0.204 |
| 1433.54 | 0.98 | 1.748 | 0.212 |
| 1433.94 | 0.976 | 1.748 | 0.204 |
| 1434.53 | 0.977 | 1.75 | 0.204 |
| 1434.93 | 0.98 | 1.747 | 0.213 |
| 1435.52 | 0.977 | 1.741 | 0.213 |
| 1435.92 | 0.978 | 1.743 | 0.213 |
| 1436.51 | 0.976 | 1.74 | 0.213 |
| 1436.91 | 0.976 | 1.74 | 0.213 |
| 1437.51 | 0.977 | 1.741 | 0.213 |
| 1437.91 | 0.974 | 1.735 | 0.213 |
| 1438.51 | 0.974 | 1.736 | 0.213 |
| 1438.91 | 0.977 | 1.737 | 0.218 |
| 1439.51 | 0.977 | 1.737 | 0.218 |
| 1439.91 | 0.978 | 1.738 | 0.218 |
| 1440.52 | 0.974 | 1.735 | 0.214 |
| 1440.92 | 0.976 | 1.729 | 0.222 |
| 1441.53 | 0.977 | 1.735 | 0.218 |
| 1441.93 | 0.975 | 1.732 | 0.218 |
| 1442.54 | 0.974 | 1.729 | 0.218 |
| 1442.95 | 0.977 | 1.731 | 0.223 |
| 1443.56 | 0.974 | 1.729 | 0.219 |
| 1443.97 | 0.977 | 1.73 | 0.224 |
| 1444.58 | 0.977 | 1.73 | 0.224 |
| 1444.99 | 0.974 | 1.729 | 0.219 |
| 1445.6 | 0.973 | 1.727 | 0.219 |
| 1446.02 | 0.973 | 1.726 | 0.219 |
| 1446.43 | 0.975 | 1.726 | 0.223 |
| 1447.05 | 0.975 | 1.723 | 0.227 |
| 1447.46 | 0.974 | 1.725 | 0.223 |
| 1448.08 | 0.976 | 1.728 | 0.224 |
| 1448.5 | 0.976 | 1.724 | 0.228 |
| 1448.92 | 0.973 | 1.722 | 0.224 |
| 1449.54 | 0.978 | 1.727 | 0.229 |
| 1449.96 | 0.973 | 1.722 | 0.224 |
| 1450.59 | 0.975 | 1.722 | 0.229 |
| 1451.01 | 0.975 | 1.721 | 0.229 |
| 1451.43 | 0.975 | 1.716 | 0.233 |
| 1452.07 | 0.975 | 1.721 | 0.229 |
| 1452.49 | 0.972 | 1.715 | 0.229 |
| 1452.91 | 0.975 | 1.716 | 0.233 |
| 1453.55 | 0.974 | 1.714 | 0.233 |
| 1453.98 | 0.974 | 1.715 | 0.233 |
| 1454.41 | 0.977 | 1.72 | 0.234 |
| 1455.05 | 0.975 | 1.716 | 0.234 |
| 1455.48 | 0.972 | 1.711 | 0.234 |
| 1455.91 | 0.975 | 1.716 | 0.234 |
| 1456.56 | 0.975 | 1.712 | 0.238 |
| 1456.99 | 0.977 | 1.719 | 0.234 |
| 1457.42 | 0.976 | 1.714 | 0.239 |
| 1458.08 | 0.975 | 1.711 | 0.239 |
| 1458.51 | 0.971 | 1.707 | 0.234 |
| 1458.95 | 0.971 | 1.707 | 0.235 |
| 1459.61 | 0.97 | 1.704 | 0.235 |
| 1460.05 | 0.978 | 1.716 | 0.24 |
| 1460.49 | 0.976 | 1.712 | 0.24 |
| 1460.93 | 0.971 | 1.706 | 0.235 |
| 1461.59 | 0.977 | 1.713 | 0.24 |
| 1462.03 | 0.972 | 1.704 | 0.24 |
| 1462.48 | 0.975 | 1.71 | 0.24 |
| 1462.92 | 0.971 | 1.701 | 0.241 |
| 1463.59 | 0.977 | 1.708 | 0.245 |
| 1464.04 | 0.97 | 1.698 | 0.241 |
| 1464.49 | 0.976 | 1.705 | 0.246 |
| 1464.94 | 0.971 | 1.7 | 0.242 |
| 1465.39 | 0.974 | 1.706 | 0.242 |
| 1466.07 | 0.972 | 1.703 | 0.242 |
| 1466.52 | 0.97 | 1.699 | 0.242 |
| 1466.97 | 0.972 | 1.702 | 0.243 |
| 1467.43 | 0.973 | 1.703 | 0.243 |
| 1468.11 | 0.974 | 1.7 | 0.248 |
| 1468.57 | 0.978 | 1.708 | 0.248 |
| 1469.03 | 0.974 | 1.699 | 0.249 |
| 1469.49 | 0.971 | 1.694 | 0.249 |
| 1469.95 | 0.972 | 1.695 | 0.249 |
| 1470.41 | 0.972 | 1.695 | 0.249 |
| 1471.1 | 0.975 | 1.7 | 0.249 |
| 1471.57 | 0.97 | 1.691 | 0.25 |
| 1472.03 | 0.972 | 1.695 | 0.25 |
| 1472.49 | 0.972 | 1.694 | 0.25 |
| 1472.96 | 0.972 | 1.69 | 0.254 |
| 1473.43 | 0.971 | 1.691 | 0.25 |
| 1473.9 | 0.975 | 1.694 | 0.255 |
| 1474.6 | 0.971 | 1.691 | 0.251 |
| 1475.07 | 0.974 | 1.697 | 0.252 |
| 1475.54 | 0.97 | 1.687 | 0.252 |
| 1476.01 | 0.973 | 1.69 | 0.257 |
| 1476.49 | 0.972 | 1.691 | 0.253 |
| 1476.96 | 0.975 | 1.691 | 0.258 |
| 1477.43 | 0.97 | 1.681 | 0.259 |
| 1477.91 | 0.972 | 1.689 | 0.255 |
| 1478.39 | 0.972 | 1.685 | 0.26 |
| 1479.1 | 0.969 | 1.681 | 0.257 |
| 1479.58 | 0.97 | 1.682 | 0.258 |
| 1480.06 | 0.972 | 1.684 | 0.259 |
| 1480.54 | 0.972 | 1.683 | 0.26 |
| 1481.02 | 0.973 | 1.684 | 0.261 |
| 1481.5 | 0.974 | 1.685 | 0.262 |
| 1481.99 | 0.974 | 1.68 | 0.268 |
| 1482.47 | 0.973 | 1.688 | 0.259 |
| 1482.95 | 0.97 | 1.677 | 0.264 |
| 1483.44 | 0.972 | 1.68 | 0.264 |
| 1483.92 | 0.972 | 1.68 | 0.264 |
| 1484.41 | 0.972 | 1.682 | 0.263 |
| 1484.9 | 0.972 | 1.676 | 0.268 |
| 1485.39 | 0.973 | 1.683 | 0.262 |
| 1486.12 | 0.973 | 1.679 | 0.266 |
| 1486.61 | 0.967 | 1.668 | 0.266 |
| 1487.1 | 0.975 | 1.681 | 0.27 |
| 1487.59 | 0.973 | 1.676 | 0.269 |
| 1488.09 | 0.973 | 1.677 | 0.268 |
| 1488.58 | 0.975 | 1.678 | 0.272 |
| 1489.07 | 0.969 | 1.667 | 0.271 |
| 1489.57 | 0.97 | 1.669 | 0.271 |
| 1490.06 | 0.969 | 1.669 | 0.27 |
| 1490.56 | 0.97 | 1.67 | 0.269 |
| 1491.05 | 0.969 | 1.665 | 0.273 |
| 1491.55 | 0.969 | 1.667 | 0.272 |
| 1492.05 | 0.969 | 1.667 | 0.271 |
| 1492.54 | 0.968 | 1.662 | 0.275 |
| 1493.04 | 0.971 | 1.669 | 0.274 |
| 1493.54 | 0.975 | 1.676 | 0.273 |
| 1494.04 | 0.975 | 1.672 | 0.277 |
| 1494.54 | 0.969 | 1.667 | 0.272 |
| 1495.04 | 0.968 | 1.662 | 0.275 |
| 1495.54 | 0.971 | 1.662 | 0.279 |
| 1496.05 | 0.969 | 1.664 | 0.273 |
| 1496.55 | 0.968 | 1.659 | 0.277 |
| 1497.05 | 0.971 | 1.666 | 0.277 |
| 1497.56 | 0.965 | 1.655 | 0.276 |
| 1498.06 | 0.971 | 1.662 | 0.28 |
| 1498.56 | 0.968 | 1.657 | 0.279 |
| 1499.07 | 0.971 | 1.659 | 0.282 |
| 1499.57 | 0.971 | 1.66 | 0.282 |
| 1500.08 | 0.966 | 1.65 | 0.281 |